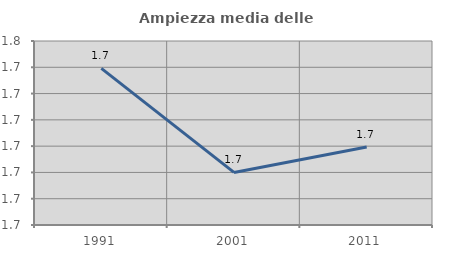
| Category | Ampiezza media delle famiglie |
|---|---|
| 1991.0 | 1.74 |
| 2001.0 | 1.7 |
| 2011.0 | 1.71 |